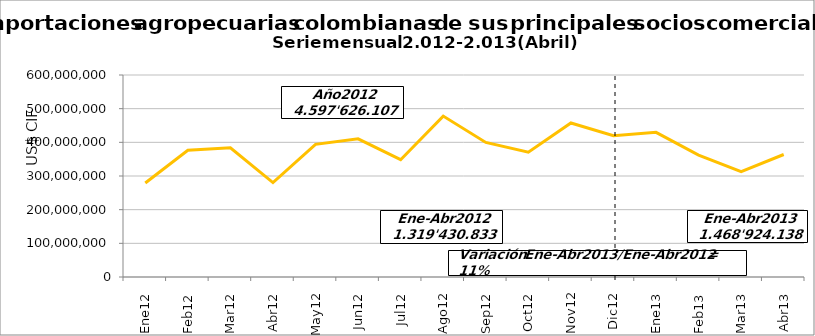
| Category | Agropecuarias |
|---|---|
| 0 | 279185589.85 |
| 1 | 376409943.96 |
| 2 | 383536782.05 |
| 3 | 280298516.96 |
| 4 | 393898919.01 |
| 5 | 410517419.17 |
| 6 | 348419076.06 |
| 7 | 477956948.8 |
| 8 | 399738197.35 |
| 9 | 370552931.6 |
| 10 | 457434826.86 |
| 11 | 419676955.56 |
| 12 | 429753963.98 |
| 13 | 362300523.63 |
| 14 | 313043300.8 |
| 15 | 363826349.16 |